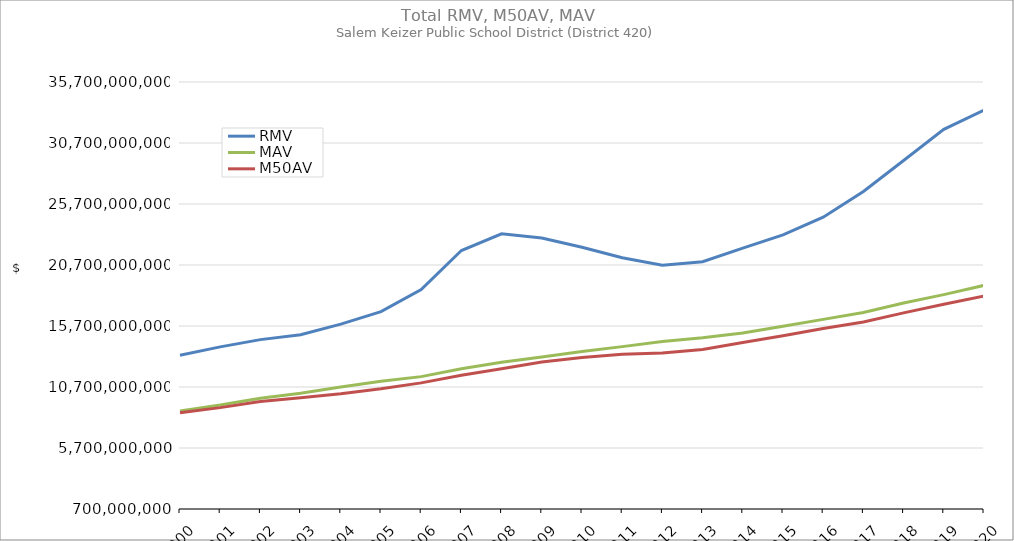
| Category | RMV | MAV | M50AV |
|---|---|---|---|
| 2000.0 | 13309053565 | 8740641628 | 8591315286 |
| 2001.0 | 13989310816 | 9223711509 | 9009274019 |
| 2002.0 | 14583772872 | 9785200167 | 9510126610 |
| 2003.0 | 14980705723 | 10190794359 | 9816264363 |
| 2004.0 | 15850136893 | 10692370553 | 10146867931 |
| 2005.0 | 16882810499 | 11176117995 | 10552405220 |
| 2006.0 | 18683219005 | 11550587581 | 11037742929 |
| 2007.0 | 21887002030 | 12190277293 | 11659961048 |
| 2008.0 | 23257967436 | 12736259130 | 12189805798 |
| 2009.0 | 22916159660 | 13163991459 | 12748109416 |
| 2010.0 | 22159932110 | 13615934580 | 13110003037 |
| 2011.0 | 21298575660 | 14009603257 | 13390848248 |
| 2012.0 | 20685608267 | 14430721890 | 13486542865 |
| 2013.0 | 20962906893 | 14733117585 | 13777198446 |
| 2014.0 | 22079590311 | 15118754676 | 14340009286 |
| 2015.0 | 23173661671 | 15675490980 | 14902092531 |
| 2016.0 | 24617063457 | 16244367785 | 15491518192 |
| 2017.0 | 26730415075 | 16811941786 | 16033986286 |
| 2018.0 | 29268381159 | 17583763068 | 16776331975 |
| 2019.0 | 31821345138 | 18269778368 | 17479997990 |
| 2020.0 | 33389845279 | 19027314507 | 18159522422 |